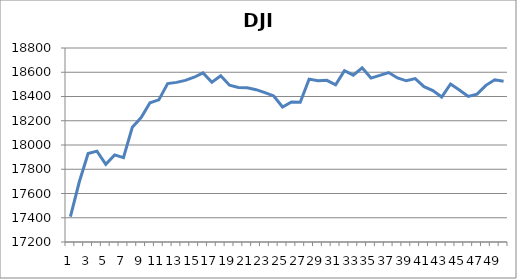
| Category | Series 0 |
|---|---|
| 0 | 17409.721 |
| 1 | 17694.68 |
| 2 | 17929.99 |
| 3 | 17949.369 |
| 4 | 17840.619 |
| 5 | 17918.619 |
| 6 | 17895.881 |
| 7 | 18146.74 |
| 8 | 18226.93 |
| 9 | 18347.67 |
| 10 | 18372.119 |
| 11 | 18506.41 |
| 12 | 18516.551 |
| 13 | 18533.051 |
| 14 | 18559.01 |
| 15 | 18595.029 |
| 16 | 18517.23 |
| 17 | 18570.85 |
| 18 | 18493.061 |
| 19 | 18473.75 |
| 20 | 18472.17 |
| 21 | 18456.35 |
| 22 | 18432.24 |
| 23 | 18404.51 |
| 24 | 18313.77 |
| 25 | 18355 |
| 26 | 18352.051 |
| 27 | 18543.529 |
| 28 | 18529.289 |
| 29 | 18533.051 |
| 30 | 18495.66 |
| 31 | 18613.52 |
| 32 | 18576.471 |
| 33 | 18636.051 |
| 34 | 18552.02 |
| 35 | 18573.939 |
| 36 | 18597.699 |
| 37 | 18552.57 |
| 38 | 18529.42 |
| 39 | 18547.301 |
| 40 | 18481.48 |
| 41 | 18448.41 |
| 42 | 18395.4 |
| 43 | 18502.99 |
| 44 | 18454.301 |
| 45 | 18400.881 |
| 46 | 18419.301 |
| 47 | 18491.961 |
| 48 | 18538.119 |
| 49 | 18526.141 |